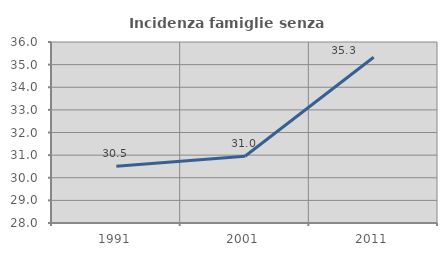
| Category | Incidenza famiglie senza nuclei |
|---|---|
| 1991.0 | 30.508 |
| 2001.0 | 30.952 |
| 2011.0 | 35.323 |